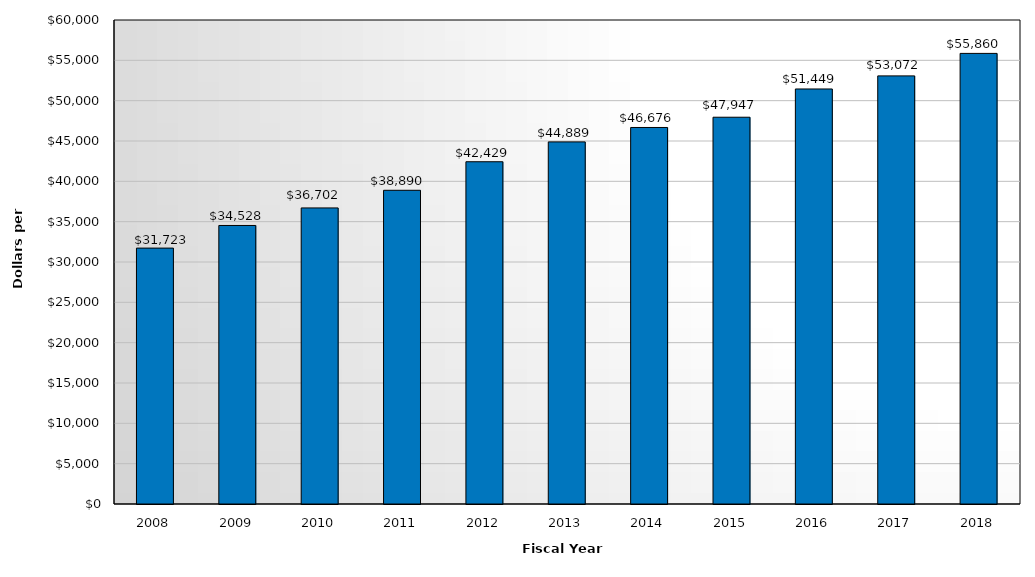
| Category | Tuition and Fees |
|---|---|
| 2008.0 | 31723 |
| 2009.0 | 34528 |
| 2010.0 | 36702 |
| 2011.0 | 38890 |
| 2012.0 | 42429 |
| 2013.0 | 44889 |
| 2014.0 | 46676 |
| 2015.0 | 47947 |
| 2016.0 | 51449 |
| 2017.0 | 53072 |
| 2018.0 | 55860 |